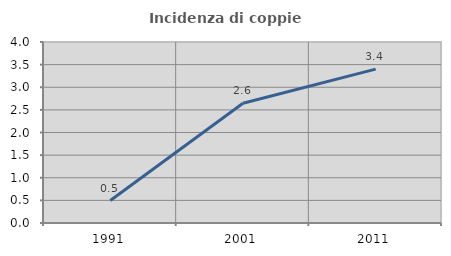
| Category | Incidenza di coppie miste |
|---|---|
| 1991.0 | 0.496 |
| 2001.0 | 2.647 |
| 2011.0 | 3.4 |